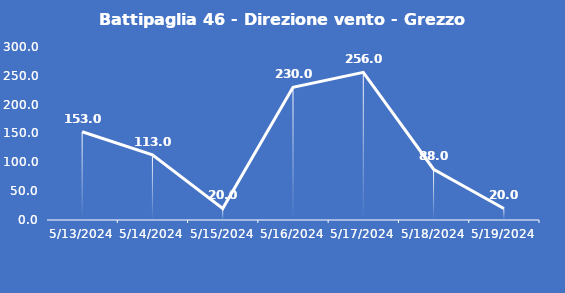
| Category | Battipaglia 46 - Direzione vento - Grezzo (°N) |
|---|---|
| 5/13/24 | 153 |
| 5/14/24 | 113 |
| 5/15/24 | 20 |
| 5/16/24 | 230 |
| 5/17/24 | 256 |
| 5/18/24 | 88 |
| 5/19/24 | 20 |